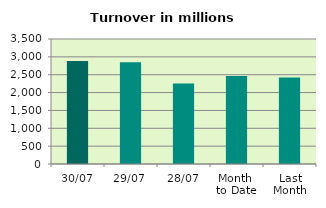
| Category | Series 0 |
|---|---|
| 30/07 | 2882.484 |
| 29/07 | 2847.482 |
| 28/07 | 2254.878 |
| Month 
to Date | 2466.495 |
| Last
Month | 2424.747 |